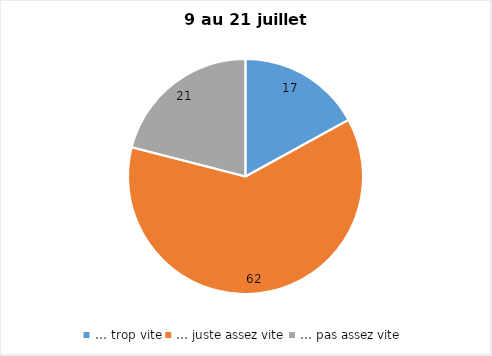
| Category | Series 0 |
|---|---|
| … trop vite | 17 |
| … juste assez vite | 62 |
| … pas assez vite | 21 |